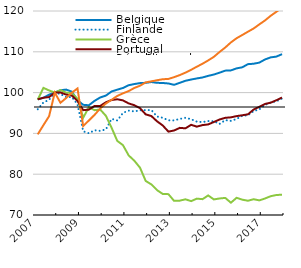
| Category | Belgique | Finlande | Grèce | Portugal | République slovaque |
|---|---|---|---|---|---|
| 2007-03-01 | 98.349 | 95.936 | 98.26 | 98.351 | 89.765 |
| 2007-06-01 | 98.735 | 97.563 | 101.16 | 98.736 | 92.019 |
| 2007-09-01 | 99.497 | 98.243 | 100.527 | 98.908 | 94.217 |
| 2007-12-01 | 100 | 100 | 100 | 100 | 100 |
| 2008-03-01 | 100.578 | 99.639 | 100.626 | 100.029 | 97.505 |
| 2008-06-01 | 100.738 | 98.892 | 99.993 | 99.517 | 98.667 |
| 2008-09-01 | 100.231 | 98.9 | 99.887 | 99.286 | 99.978 |
| 2008-12-01 | 98.133 | 97.133 | 98.51 | 97.952 | 101.019 |
| 2009-03-01 | 97.004 | 90.528 | 93.842 | 95.699 | 91.81 |
| 2009-06-01 | 96.898 | 90.028 | 96.42 | 95.827 | 93.161 |
| 2009-09-01 | 97.978 | 90.769 | 95.696 | 96.723 | 94.541 |
| 2009-12-01 | 98.805 | 90.612 | 95.848 | 96.717 | 96.12 |
| 2010-03-01 | 99.274 | 91.001 | 94.3 | 97.639 | 97.33 |
| 2010-06-01 | 100.276 | 93.571 | 91.376 | 98.185 | 98.238 |
| 2010-09-01 | 100.719 | 93.166 | 88.157 | 98.363 | 99.185 |
| 2010-12-01 | 101.136 | 95.031 | 87.12 | 98.088 | 99.818 |
| 2011-03-01 | 101.805 | 95.583 | 84.61 | 97.352 | 100.372 |
| 2011-06-01 | 102.099 | 95.384 | 83.306 | 96.908 | 101.135 |
| 2011-09-01 | 102.327 | 95.673 | 81.595 | 96.186 | 101.687 |
| 2011-12-01 | 102.396 | 95.712 | 78.344 | 94.664 | 102.501 |
| 2012-03-01 | 102.595 | 95.718 | 77.495 | 94.254 | 102.761 |
| 2012-06-01 | 102.397 | 94.139 | 76.096 | 92.962 | 103.032 |
| 2012-09-01 | 102.357 | 93.83 | 75.154 | 91.944 | 103.276 |
| 2012-12-01 | 102.234 | 93.212 | 75.11 | 90.437 | 103.349 |
| 2013-03-01 | 101.907 | 93.182 | 73.463 | 90.712 | 103.785 |
| 2013-06-01 | 102.398 | 93.547 | 73.52 | 91.355 | 104.292 |
| 2013-09-01 | 102.898 | 93.83 | 73.845 | 91.243 | 104.897 |
| 2013-12-01 | 103.202 | 93.481 | 73.401 | 92.109 | 105.591 |
| 2014-03-01 | 103.475 | 92.887 | 74.012 | 91.656 | 106.347 |
| 2014-06-01 | 103.708 | 92.782 | 73.882 | 92.034 | 107.075 |
| 2014-09-01 | 104.101 | 93.027 | 74.792 | 92.199 | 107.888 |
| 2014-12-01 | 104.429 | 92.981 | 73.815 | 92.795 | 108.768 |
| 2015-03-01 | 104.881 | 92.318 | 74.049 | 93.407 | 109.957 |
| 2015-06-01 | 105.384 | 93.256 | 74.192 | 93.82 | 111.051 |
| 2015-09-01 | 105.446 | 93.065 | 73.013 | 93.935 | 112.302 |
| 2015-12-01 | 105.935 | 93.541 | 74.217 | 94.239 | 113.326 |
| 2016-03-01 | 106.205 | 94.32 | 73.757 | 94.445 | 114.12 |
| 2016-06-01 | 106.971 | 94.451 | 73.495 | 94.673 | 114.927 |
| 2016-09-01 | 107.075 | 95.463 | 73.869 | 95.846 | 115.715 |
| 2016-12-01 | 107.349 | 95.892 | 73.58 | 96.517 | 116.722 |
| 2017-03-01 | 108.121 | 96.992 | 74.051 | 97.22 | 117.682 |
| 2017-06-01 | 108.636 | 97.574 | 74.605 | 97.533 | 118.828 |
| 2017-09-01 | 108.822 | 97.866 | 74.903 | 98.126 | 119.806 |
| 2017-12-01 | 109.419 | 98.551 | 74.975 | 98.79 | 120.861 |